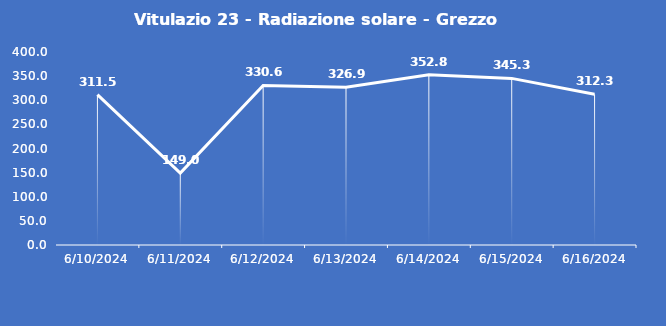
| Category | Vitulazio 23 - Radiazione solare - Grezzo (W/m2) |
|---|---|
| 6/10/24 | 311.5 |
| 6/11/24 | 149 |
| 6/12/24 | 330.6 |
| 6/13/24 | 326.9 |
| 6/14/24 | 352.8 |
| 6/15/24 | 345.3 |
| 6/16/24 | 312.3 |